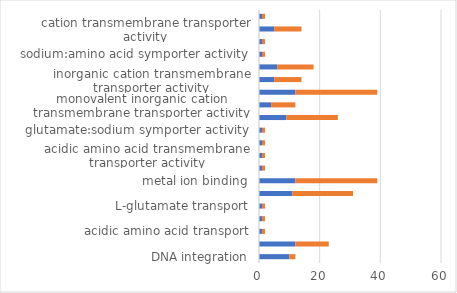
| Category | up | down |
|---|---|---|
| DNA integration | 10 | 2 |
| DNA metabolic process | 12 | 11 |
| acidic amino acid transport | 1 | 1 |
| L-amino acid transport | 1 | 1 |
| L-glutamate transport | 1 | 1 |
| transition metal ion binding | 11 | 20 |
| metal ion binding | 12 | 27 |
| L-glutamate transmembrane transporter activity | 1 | 1 |
| acidic amino acid transmembrane transporter activity | 1 | 1 |
| L-amino acid transmembrane transporter activity | 1 | 1 |
| glutamate:sodium symporter activity | 1 | 1 |
| zinc ion binding | 9 | 17 |
| monovalent inorganic cation transmembrane transporter activity | 4 | 8 |
| cation binding | 12 | 27 |
| inorganic cation transmembrane transporter activity | 5 | 9 |
| substrate-specific transporter activity | 6 | 12 |
| sodium:amino acid symporter activity | 1 | 1 |
| cation:amino acid symporter activity | 1 | 1 |
| cation transmembrane transporter activity | 5 | 9 |
| organic acid:sodium symporter activity | 1 | 1 |